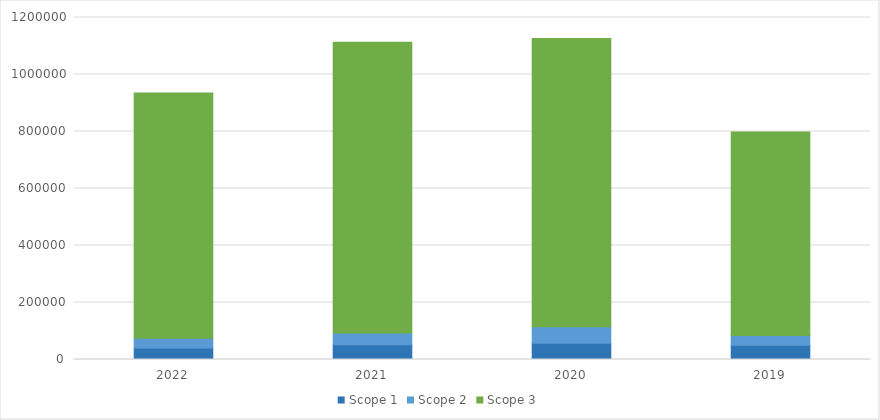
| Category | Scope 1 | Scope 2 | Scope 3 |
|---|---|---|---|
| 2022.0 | 40300 | 34200 | 860200 |
| 2021.0 | 52000 | 41000 | 1019900 |
| 2020.0 | 57000 | 58000 | 1011000 |
| 2019.0 | 50200 | 33700 | 714700 |